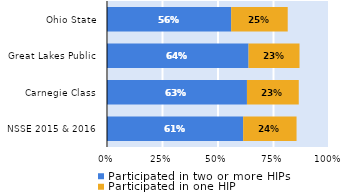
| Category | Participated in two or more HIPs | Participated in one HIP |
|---|---|---|
| NSSE 2015 & 2016 | 0.613 | 0.24 |
| Carnegie Class | 0.63 | 0.233 |
| Great Lakes Public | 0.638 | 0.23 |
| Ohio State | 0.559 | 0.255 |